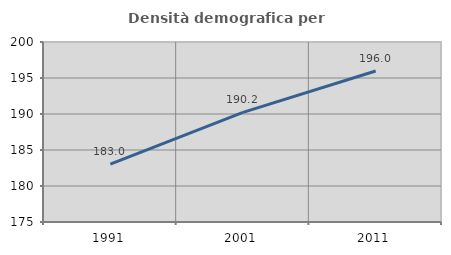
| Category | Densità demografica |
|---|---|
| 1991.0 | 183.026 |
| 2001.0 | 190.231 |
| 2011.0 | 195.979 |